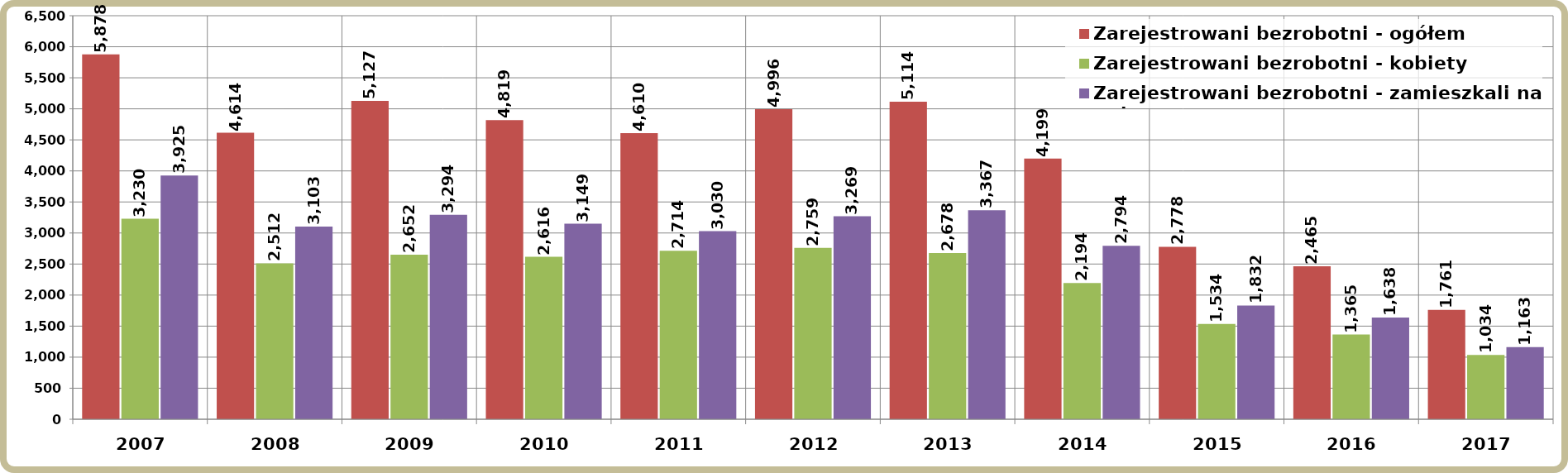
| Category | Zarejestrowani bezrobotni - ogółem | Zarejestrowani bezrobotni - kobiety | Zarejestrowani bezrobotni - zamieszkali na wsi |
|---|---|---|---|
| 2007.0 | 5878 | 3230 | 3925 |
| 2008.0 | 4614 | 2512 | 3103 |
| 2009.0 | 5127 | 2652 | 3294 |
| 2010.0 | 4819 | 2616 | 3149 |
| 2011.0 | 4610 | 2714 | 3030 |
| 2012.0 | 4996 | 2759 | 3269 |
| 2013.0 | 5114 | 2678 | 3367 |
| 2014.0 | 4199 | 2194 | 2794 |
| 2015.0 | 2778 | 1534 | 1832 |
| 2016.0 | 2465 | 1365 | 1638 |
| 2017.0 | 1761 | 1034 | 1163 |